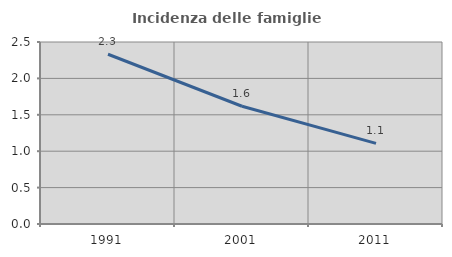
| Category | Incidenza delle famiglie numerose |
|---|---|
| 1991.0 | 2.332 |
| 2001.0 | 1.617 |
| 2011.0 | 1.108 |